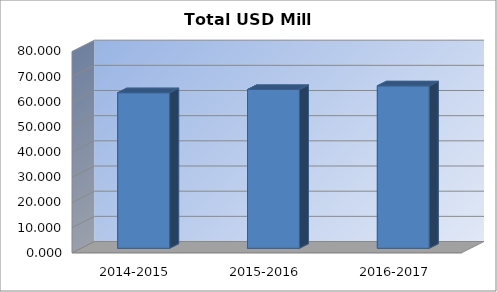
| Category | Total USD Mill Rates |
|---|---|
| 2014-2015 | 61.805 |
| 2015-2016 | 63.085 |
| 2016-2017 | 64.538 |